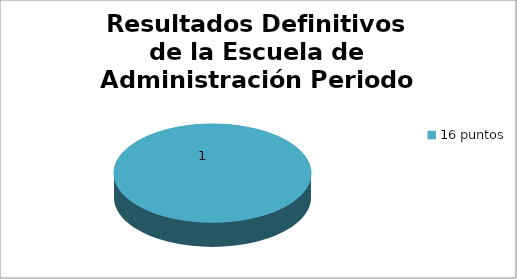
| Category | Series 0 |
|---|---|
| 16 puntos | 1 |